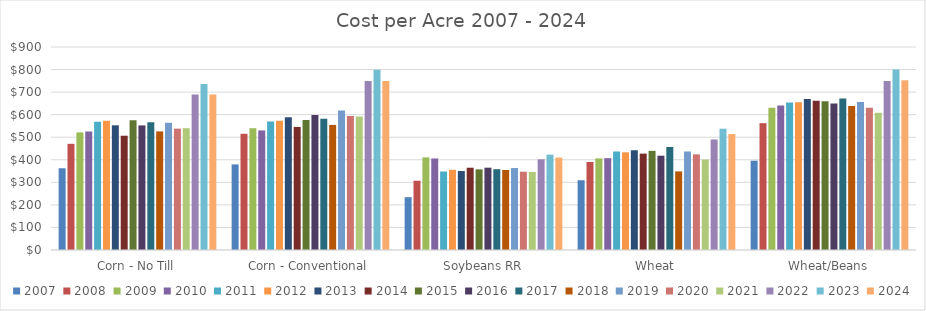
| Category | 2007 | 2008 | 2009 | 2010 | 2011 | 2012 | 2013 | 2014 | 2015 | 2016 | 2017 | 2018 | 2019 | 2020 | 2021 | 2022 | 2023 | 2024 |
|---|---|---|---|---|---|---|---|---|---|---|---|---|---|---|---|---|---|---|
| Corn - No Till | 362.4 | 470.72 | 521.49 | 525.26 | 568.66 | 572.543 | 552.863 | 506.66 | 575.5 | 552.32 | 566.37 | 525.91 | 564.05 | 538 | 540 | 689 | 735.5 | 689.636 |
| Corn - Conventional | 379.4 | 515.34 | 539.81 | 530.09 | 569.32 | 573.21 | 588.641 | 545.525 | 576.73 | 598.86 | 582.01 | 554.55 | 618.82 | 594 | 592 | 749 | 799.57 | 748.854 |
| Soybeans RR | 234.26 | 307.12 | 410.69 | 405.77 | 348.06 | 355.69 | 350.104 | 364.773 | 357.511 | 364.95 | 358.25 | 354.77 | 363.37 | 347 | 346 | 402 | 422.86 | 409.87 |
| Wheat | 309.27 | 390.14 | 406.2 | 407.26 | 436.75 | 433.187 | 442.309 | 427.348 | 439.521 | 418.12 | 456.78 | 348.58 | 436.88 | 424 | 401 | 490 | 537.64 | 514.094 |
| Wheat/Beans | 395.89 | 562.34 | 630.51 | 640.6 | 653.83 | 655.56 | 669.6 | 662.166 | 659.733 | 649.03 | 671.8 | 638.79 | 656.03 | 630.5 | 608 | 749 | 800.23 | 752.057 |